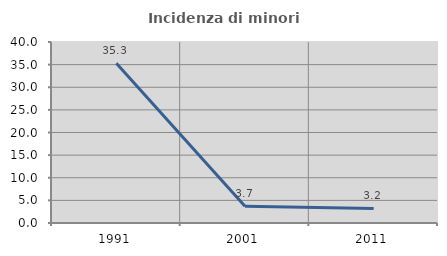
| Category | Incidenza di minori stranieri |
|---|---|
| 1991.0 | 35.294 |
| 2001.0 | 3.704 |
| 2011.0 | 3.226 |